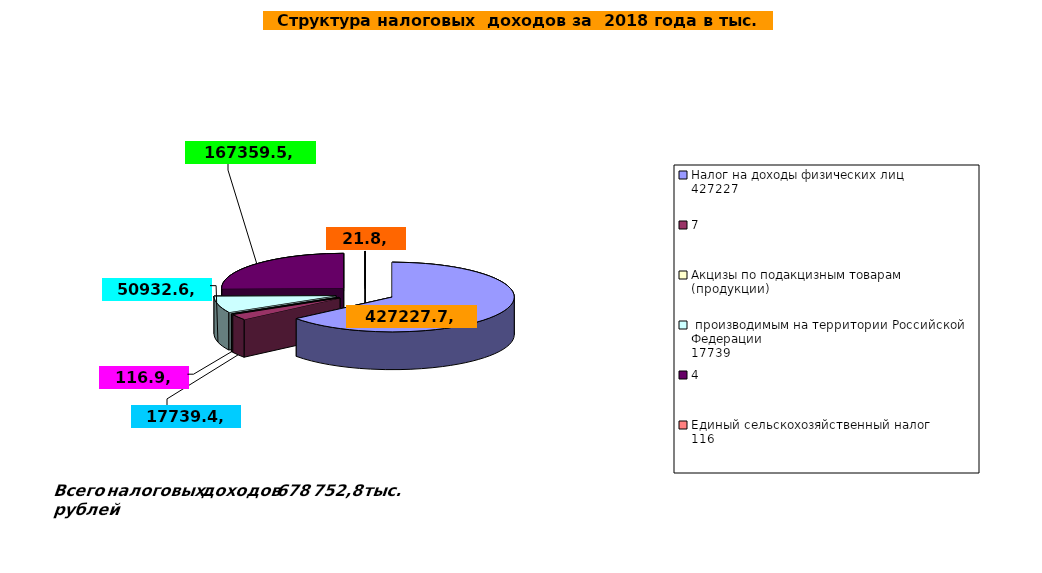
| Category | налоговые доходы |
|---|---|
| 0 | 427227.7 |
| 1 | 17739.4 |
| 2 | 116.9 |
| 3 | 50932.6 |
| 4 | 167359.5 |
| 5 | 21.8 |